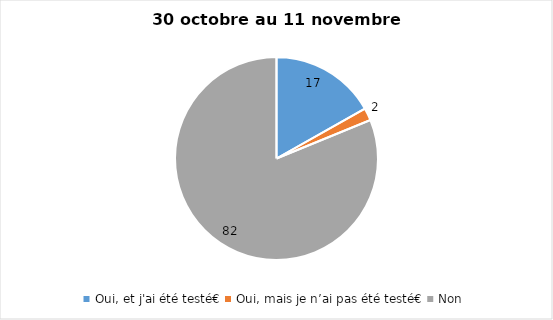
| Category | Series 0 |
|---|---|
| Oui, et j'ai été testé€ | 17 |
| Oui, mais je n’ai pas été testé€ | 2 |
| Non | 82 |